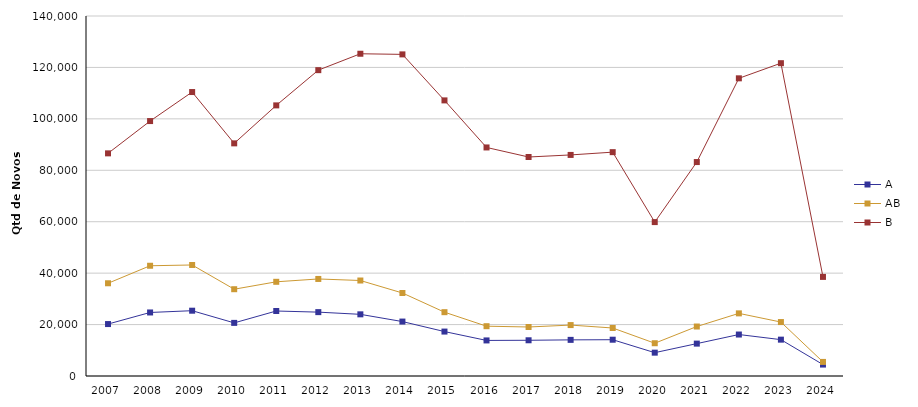
| Category | A | AB | B |
|---|---|---|---|
| 2007 | 20201 | 36063 | 86584 |
| 2008 | 24706 | 42873 | 99142 |
| 2009 | 25395 | 43178 | 110429 |
| 2010 | 20656 | 33753 | 90473 |
| 2011 | 25274 | 36631 | 105242 |
| 2012 | 24840 | 37739 | 118942 |
| 2013 | 23982 | 37135 | 125317 |
| 2014 | 21167 | 32287 | 125074 |
| 2015 | 17278 | 24820 | 107182 |
| 2016 | 13834 | 19369 | 88881 |
| 2017 | 13894 | 19061 | 85161 |
| 2018 | 14051 | 19802 | 85971 |
| 2019 | 14112 | 18671 | 87054 |
| 2020 | 9076 | 12747 | 59856 |
| 2021 | 12591 | 19243 | 83202 |
| 2022 | 16128 | 24360 | 115763 |
| 2023 | 14137 | 20978 | 121650 |
| 2024 | 4446 | 5477 | 38539 |